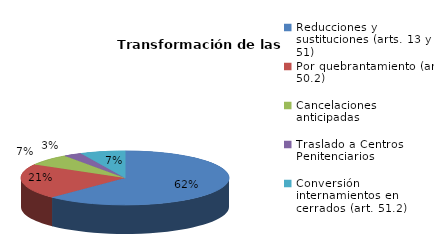
| Category | Series 0 |
|---|---|
| Reducciones y sustituciones (arts. 13 y 51) | 134 |
| Por quebrantamiento (art. 50.2) | 45 |
| Cancelaciones anticipadas | 15 |
| Traslado a Centros Penitenciarios | 6 |
| Conversión internamientos en cerrados (art. 51.2) | 15 |